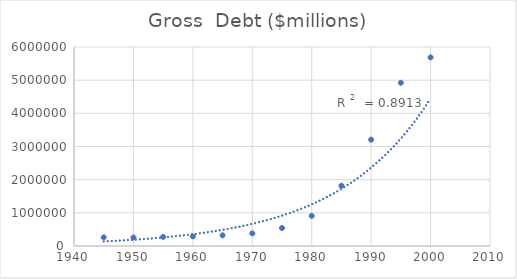
| Category | Gross  Debt ($millions) |
|---|---|
| 1945.0 | 260123 |
| 1950.0 | 256853 |
| 1955.0 | 274366 |
| 1960.0 | 290525 |
| 1965.0 | 322318 |
| 1970.0 | 380921 |
| 1975.0 | 541925 |
| 1980.0 | 909050 |
| 1985.0 | 1817521 |
| 1990.0 | 3206564 |
| 1995.0 | 4921005 |
| 2000.0 | 5686338 |